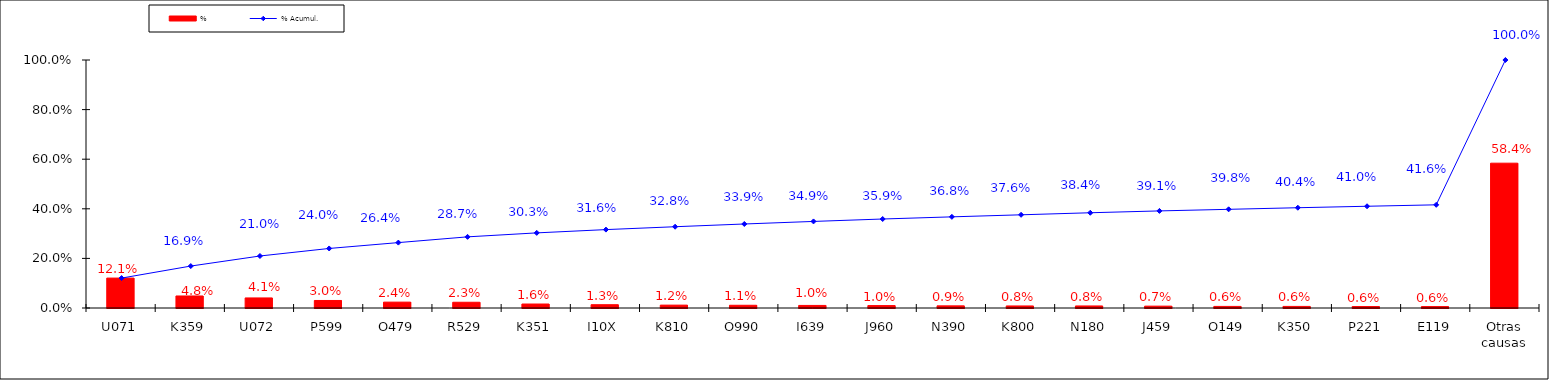
| Category | % |
|---|---|
| U071 | 0.121 |
| K359 | 0.048 |
| U072 | 0.041 |
| P599 | 0.03 |
| O479 | 0.024 |
| R529 | 0.023 |
| K351 | 0.016 |
| I10X | 0.013 |
| K810 | 0.012 |
| O990 | 0.011 |
| I639 | 0.01 |
| J960 | 0.01 |
| N390 | 0.009 |
| K800 | 0.008 |
| N180 | 0.008 |
| J459 | 0.007 |
| O149 | 0.006 |
| K350 | 0.006 |
| P221 | 0.006 |
| E119 | 0.006 |
| Otras causas | 0.584 |